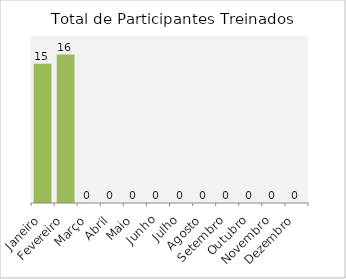
| Category | Participantes Treinados |
|---|---|
| Janeiro | 15 |
| Fevereiro | 16 |
| Março | 0 |
| Abril | 0 |
| Maio | 0 |
| Junho | 0 |
| Julho | 0 |
| Agosto | 0 |
| Setembro | 0 |
| Outubro | 0 |
| Novembro | 0 |
| Dezembro | 0 |